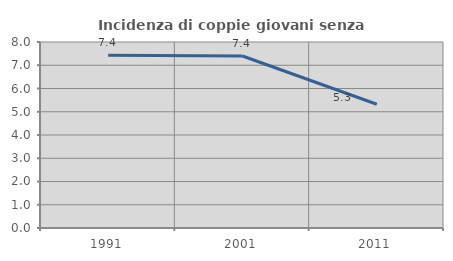
| Category | Incidenza di coppie giovani senza figli |
|---|---|
| 1991.0 | 7.432 |
| 2001.0 | 7.398 |
| 2011.0 | 5.322 |